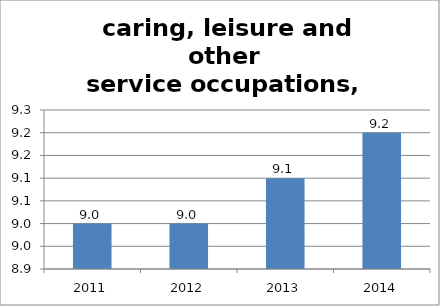
| Category | 6: Caring, leisure & other service  |
|---|---|
| 2011.0 | 9 |
| 2012.0 | 9 |
| 2013.0 | 9.1 |
| 2014.0 | 9.2 |